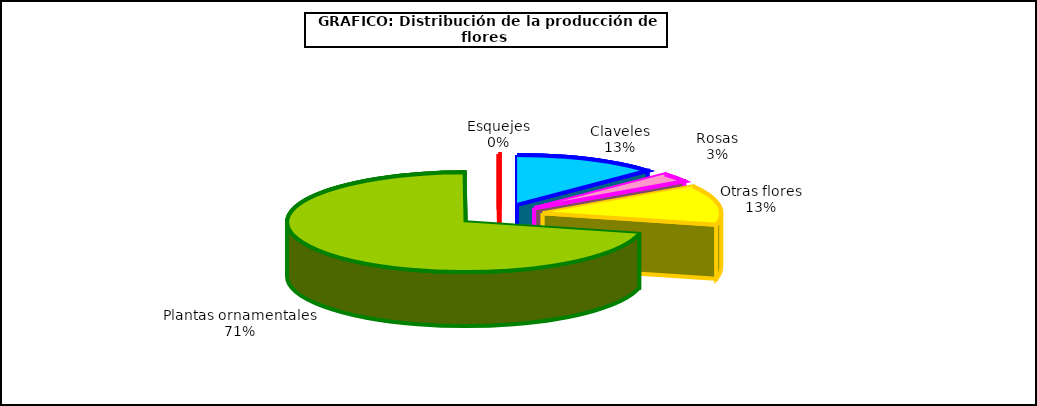
| Category | Series 0 |
|---|---|
| 0 | 49065 |
| 1 | 10725 |
| 2 | 48171 |
| 3 | 267641 |
| 4 | 321 |